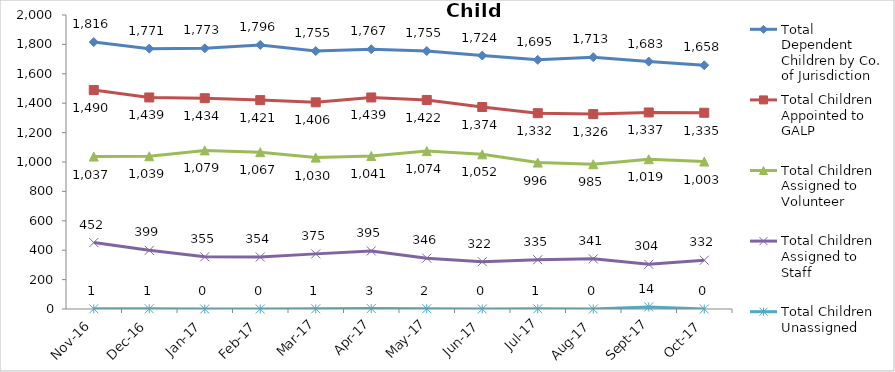
| Category | Total Dependent Children by Co. of Jurisdiction | Total Children Appointed to GALP | Total Children Assigned to Volunteer | Total Children Assigned to Staff | Total Children Unassigned |
|---|---|---|---|---|---|
| 2016-11-01 | 1816 | 1490 | 1037 | 452 | 1 |
| 2016-12-01 | 1771 | 1439 | 1039 | 399 | 1 |
| 2017-01-01 | 1773 | 1434 | 1079 | 355 | 0 |
| 2017-02-01 | 1796 | 1421 | 1067 | 354 | 0 |
| 2017-03-01 | 1755 | 1406 | 1030 | 375 | 1 |
| 2017-04-01 | 1767 | 1439 | 1041 | 395 | 3 |
| 2017-05-01 | 1755 | 1422 | 1074 | 346 | 2 |
| 2017-06-01 | 1724 | 1374 | 1052 | 322 | 0 |
| 2017-07-01 | 1695 | 1332 | 996 | 335 | 1 |
| 2017-08-01 | 1713 | 1326 | 985 | 341 | 0 |
| 2017-09-01 | 1683 | 1337 | 1019 | 304 | 14 |
| 2017-10-01 | 1658 | 1335 | 1003 | 332 | 0 |